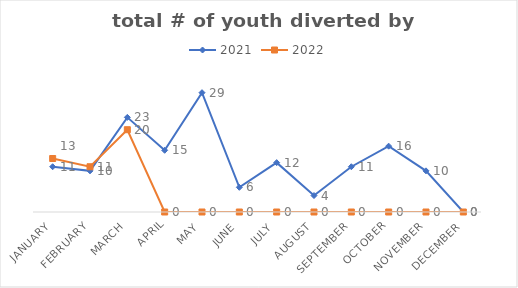
| Category | 2021 | 2022 |
|---|---|---|
| January | 11 | 13 |
| February | 10 | 11 |
| March | 23 | 20 |
| April | 15 | 0 |
| May | 29 | 0 |
| June | 6 | 0 |
| July | 12 | 0 |
| August | 4 | 0 |
| September | 11 | 0 |
| October | 16 | 0 |
| November | 10 | 0 |
| December | 0 | 0 |